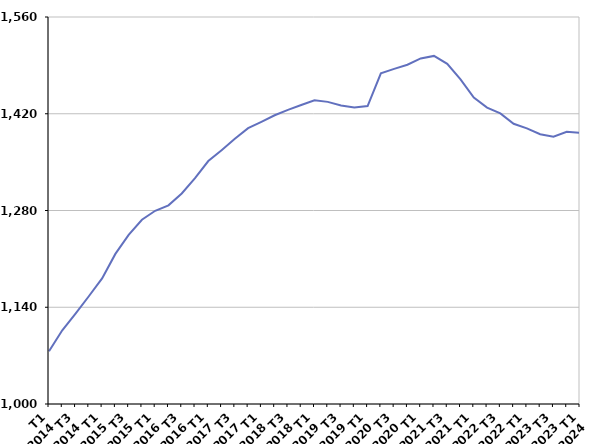
| Category | 50 ans ou plus |
|---|---|
| T1
2014 | 1076.2 |
| T2
2014 | 1106.6 |
| T3
2014 | 1130.7 |
| T4
2014 | 1155.9 |
| T1
2015 | 1181.7 |
| T2
2015 | 1217.2 |
| T3
2015 | 1244.7 |
| T4
2015 | 1266.6 |
| T1
2016 | 1279.6 |
| T2
2016 | 1287.5 |
| T3
2016 | 1304.7 |
| T4
2016 | 1326.8 |
| T1
2017 | 1351.6 |
| T2
2017 | 1367.3 |
| T3
2017 | 1383.7 |
| T4
2017 | 1399.1 |
| T1
2018 | 1408.2 |
| T2
2018 | 1417.8 |
| T3
2018 | 1425.6 |
| T4
2018 | 1432.7 |
| T1
2019 | 1439.4 |
| T2
2019 | 1437.2 |
| T3
2019 | 1432 |
| T4
2019 | 1429 |
| T1
2020 | 1431.1 |
| T2
2020 | 1478.6 |
| T3
2020 | 1485 |
| T4
2020 | 1490.9 |
| T1
2021 | 1500.1 |
| T2
2021 | 1503.7 |
| T3
2021 | 1492.2 |
| T4
2021 | 1469.8 |
| T1
2022 | 1443.3 |
| T2
2022 | 1428.9 |
| T3
2022 | 1420.5 |
| T4
2022 | 1405.5 |
| T1
2023 | 1398.9 |
| T2
2023 | 1390.4 |
| T3
2023 | 1386.7 |
| T4
2023 | 1394 |
| T1
2024 | 1392.3 |